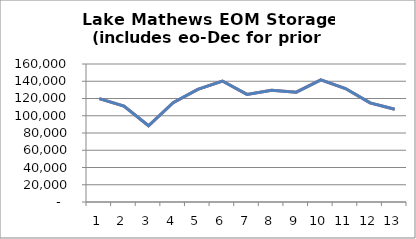
| Category | Lake Mathews EOM Storage |
|---|---|
| 0 | 119836 |
| 1 | 111282.419 |
| 2 | 88374.051 |
| 3 | 115095.919 |
| 4 | 130647.476 |
| 5 | 140231.669 |
| 6 | 124776.074 |
| 7 | 129451.978 |
| 8 | 127342.398 |
| 9 | 141520.446 |
| 10 | 131531.251 |
| 11 | 114938.513 |
| 12 | 107476.606 |